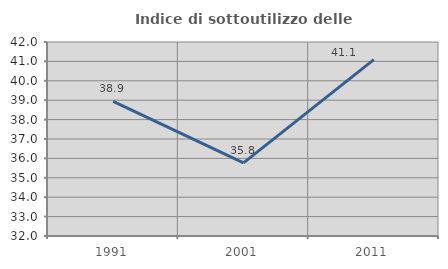
| Category | Indice di sottoutilizzo delle abitazioni  |
|---|---|
| 1991.0 | 38.941 |
| 2001.0 | 35.771 |
| 2011.0 | 41.09 |